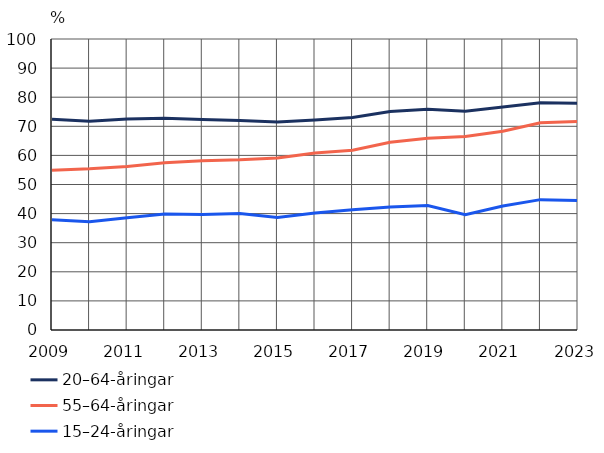
| Category | 20–64-åringar | 55–64-åringar | 15–24-åringar |
|---|---|---|---|
| 2009 | 72.4 | 54.9 | 37.9 |
| 2010 | 71.7 | 55.4 | 37.2 |
| 2011 | 72.5 | 56.2 | 38.6 |
| 2012 | 72.8 | 57.5 | 39.9 |
| 2013 | 72.3 | 58.2 | 39.7 |
| 2014 | 72 | 58.5 | 40 |
| 2015 | 71.5 | 59.1 | 38.7 |
| 2016 | 72.2 | 60.8 | 40.2 |
| 2017 | 73 | 61.8 | 41.3 |
| 2018 | 75.1 | 64.5 | 42.3 |
| 2019 | 75.9 | 65.9 | 42.8 |
| 2020 | 75.2 | 66.5 | 39.6 |
| 2021 | 76.6 | 68.3 | 42.6 |
| 2022 | 78.1 | 71.2 | 44.8 |
| 2023 | 77.9 | 71.7 | 44.5 |